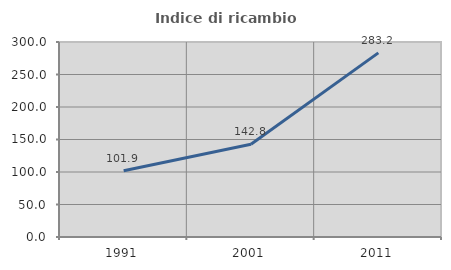
| Category | Indice di ricambio occupazionale  |
|---|---|
| 1991.0 | 101.899 |
| 2001.0 | 142.8 |
| 2011.0 | 283.24 |